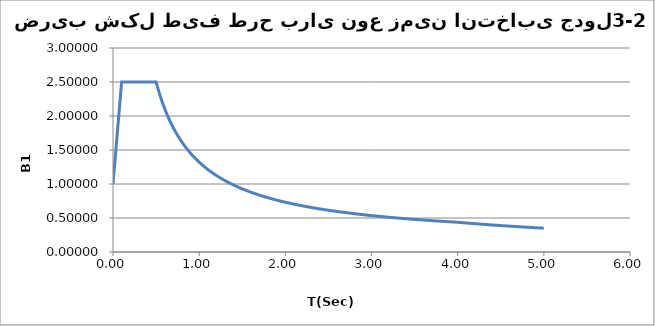
| Category | Series 0 |
|---|---|
| 0.0 | 1 |
| 0.025 | 1.375 |
| 0.05 | 1.75 |
| 0.075 | 2.125 |
| 0.1 | 2.5 |
| 0.125 | 2.5 |
| 0.15 | 2.5 |
| 0.175 | 2.5 |
| 0.2 | 2.5 |
| 0.225 | 2.5 |
| 0.25 | 2.5 |
| 0.275 | 2.5 |
| 0.3 | 2.5 |
| 0.325 | 2.5 |
| 0.35 | 2.5 |
| 0.375 | 2.5 |
| 0.4 | 2.5 |
| 0.425 | 2.5 |
| 0.45 | 2.5 |
| 0.475 | 2.5 |
| 0.5 | 2.5 |
| 0.525 | 2.388 |
| 0.55 | 2.286 |
| 0.575 | 2.193 |
| 0.6 | 2.107 |
| 0.625 | 2.029 |
| 0.65 | 1.956 |
| 0.675 | 1.889 |
| 0.7 | 1.827 |
| 0.725 | 1.768 |
| 0.75 | 1.714 |
| 0.775 | 1.664 |
| 0.8 | 1.616 |
| 0.825 | 1.571 |
| 0.85 | 1.529 |
| 0.875 | 1.49 |
| 0.9 | 1.452 |
| 0.925 | 1.417 |
| 0.95 | 1.383 |
| 0.975 | 1.352 |
| 1.0 | 1.321 |
| 1.025 | 1.293 |
| 1.05 | 1.265 |
| 1.075 | 1.239 |
| 1.1 | 1.214 |
| 1.125 | 1.19 |
| 1.15 | 1.168 |
| 1.175 | 1.146 |
| 1.2 | 1.125 |
| 1.225 | 1.105 |
| 1.25 | 1.086 |
| 1.275 | 1.067 |
| 1.3 | 1.049 |
| 1.325 | 1.032 |
| 1.35 | 1.016 |
| 1.375 | 1 |
| 1.4 | 0.985 |
| 1.425 | 0.97 |
| 1.45 | 0.956 |
| 1.475 | 0.942 |
| 1.5 | 0.929 |
| 1.525 | 0.916 |
| 1.55 | 0.903 |
| 1.575 | 0.891 |
| 1.6 | 0.879 |
| 1.625 | 0.868 |
| 1.65 | 0.857 |
| 1.675 | 0.846 |
| 1.7 | 0.836 |
| 1.725 | 0.826 |
| 1.75 | 0.816 |
| 1.775 | 0.807 |
| 1.8 | 0.798 |
| 1.825 | 0.789 |
| 1.85 | 0.78 |
| 1.875 | 0.771 |
| 1.9 | 0.763 |
| 1.925 | 0.755 |
| 1.95 | 0.747 |
| 1.975 | 0.74 |
| 2.0 | 0.732 |
| 2.025 | 0.725 |
| 2.05 | 0.718 |
| 2.075 | 0.711 |
| 2.1 | 0.704 |
| 2.125 | 0.697 |
| 2.15 | 0.691 |
| 2.175 | 0.685 |
| 2.2 | 0.679 |
| 2.225 | 0.673 |
| 2.25 | 0.667 |
| 2.275 | 0.661 |
| 2.3 | 0.655 |
| 2.325 | 0.65 |
| 2.35 | 0.644 |
| 2.375 | 0.639 |
| 2.4 | 0.634 |
| 2.425 | 0.629 |
| 2.45 | 0.624 |
| 2.475 | 0.619 |
| 2.5 | 0.614 |
| 2.525 | 0.61 |
| 2.55 | 0.605 |
| 2.575 | 0.601 |
| 2.6 | 0.596 |
| 2.625 | 0.592 |
| 2.65 | 0.588 |
| 2.675 | 0.583 |
| 2.7 | 0.579 |
| 2.725 | 0.575 |
| 2.75 | 0.571 |
| 2.775 | 0.568 |
| 2.8 | 0.564 |
| 2.825 | 0.56 |
| 2.85 | 0.556 |
| 2.875 | 0.553 |
| 2.9 | 0.549 |
| 2.925 | 0.546 |
| 2.95 | 0.542 |
| 2.975 | 0.539 |
| 3.0 | 0.536 |
| 3.025 | 0.532 |
| 3.05 | 0.529 |
| 3.075 | 0.526 |
| 3.1 | 0.523 |
| 3.125 | 0.52 |
| 3.15 | 0.517 |
| 3.175 | 0.514 |
| 3.2 | 0.511 |
| 3.225 | 0.508 |
| 3.25 | 0.505 |
| 3.275 | 0.503 |
| 3.3 | 0.5 |
| 3.325 | 0.497 |
| 3.35 | 0.495 |
| 3.375 | 0.492 |
| 3.4 | 0.489 |
| 3.425 | 0.487 |
| 3.45 | 0.484 |
| 3.475 | 0.482 |
| 3.5 | 0.48 |
| 3.525 | 0.477 |
| 3.55 | 0.475 |
| 3.575 | 0.473 |
| 3.6 | 0.47 |
| 3.625 | 0.468 |
| 3.65 | 0.466 |
| 3.675 | 0.464 |
| 3.7 | 0.461 |
| 3.725 | 0.459 |
| 3.75 | 0.457 |
| 3.775 | 0.455 |
| 3.8 | 0.453 |
| 3.825 | 0.451 |
| 3.85 | 0.449 |
| 3.875 | 0.447 |
| 3.9 | 0.445 |
| 3.925 | 0.443 |
| 3.95 | 0.441 |
| 3.975 | 0.439 |
| 4.0 | 0.438 |
| 4.025 | 0.435 |
| 4.05 | 0.432 |
| 4.075 | 0.429 |
| 4.1 | 0.427 |
| 4.125 | 0.424 |
| 4.15 | 0.422 |
| 4.175 | 0.419 |
| 4.2 | 0.417 |
| 4.225 | 0.414 |
| 4.25 | 0.412 |
| 4.275 | 0.409 |
| 4.3 | 0.407 |
| 4.325 | 0.405 |
| 4.35 | 0.402 |
| 4.375 | 0.4 |
| 4.4 | 0.398 |
| 4.425 | 0.395 |
| 4.45 | 0.393 |
| 4.475 | 0.391 |
| 4.5 | 0.389 |
| 4.525 | 0.387 |
| 4.55 | 0.385 |
| 4.575 | 0.383 |
| 4.6 | 0.38 |
| 4.625 | 0.378 |
| 4.65 | 0.376 |
| 4.675 | 0.374 |
| 4.7 | 0.372 |
| 4.725 | 0.37 |
| 4.75 | 0.368 |
| 4.775 | 0.366 |
| 4.8 | 0.365 |
| 4.825 | 0.363 |
| 4.85 | 0.361 |
| 4.875 | 0.359 |
| 4.9 | 0.357 |
| 4.925 | 0.355 |
| 4.95 | 0.354 |
| 4.975 | 0.352 |
| 5.0 | 0.35 |